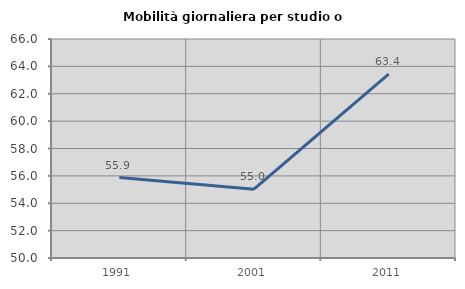
| Category | Mobilità giornaliera per studio o lavoro |
|---|---|
| 1991.0 | 55.877 |
| 2001.0 | 55.031 |
| 2011.0 | 63.433 |